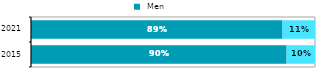
| Category |  Men |  Women |
|---|---|---|
| 2015.0 | 0.9 | 0.1 |
| 2021.0 | 0.885 | 0.115 |